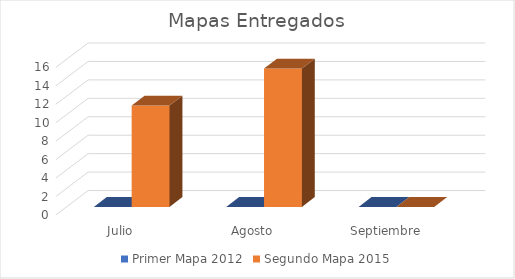
| Category | Primer Mapa 2012 | Segundo Mapa 2015 |
|---|---|---|
| Julio | 0 | 11 |
| Agosto | 0 | 15 |
| Septiembre | 0 | 0 |